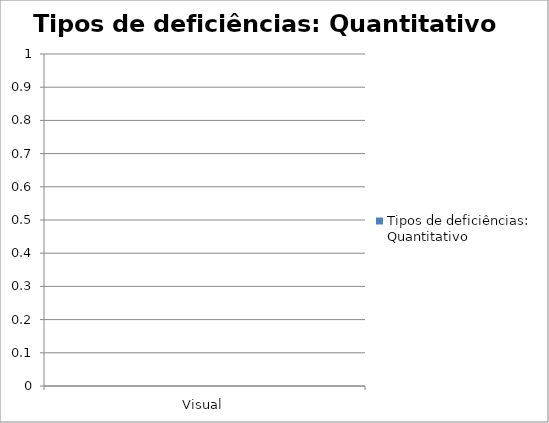
| Category | Tipos de deficiências: Quantitativo |
|---|---|
| Visual | 0 |